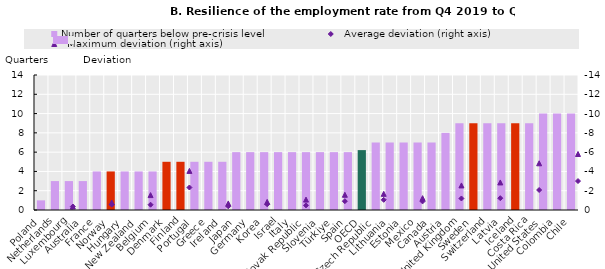
| Category | Number of quarters below pre-crisis level |
|---|---|
| Poland | 1 |
| Netherlands | 3 |
| Luxembourg | 3 |
| Australia | 3 |
| France | 4 |
| Norway | 4 |
| Hungary | 4 |
| New Zealand | 4 |
| Belgium | 4 |
| Denmark | 5 |
| Finland | 5 |
| Portugal | 5 |
| Greece | 5 |
| Ireland | 5 |
| Japan | 6 |
| Germany | 6 |
| Korea | 6 |
| Israel | 6 |
| Italy | 6 |
| Slovak Republic | 6 |
| Slovenia | 6 |
| Türkiye | 6 |
| Spain | 6 |
| OECD | 6.211 |
| Czech Republic | 7 |
| Lithuania | 7 |
| Estonia | 7 |
| Mexico | 7 |
| Canada | 7 |
| Austria | 8 |
| United Kingdom | 9 |
| Sweden | 9 |
| Switzerland | 9 |
| Latvia | 9 |
| Iceland | 9 |
| Costa Rica | 9 |
| United States | 10 |
| Colombia | 10 |
| Chile | 10 |